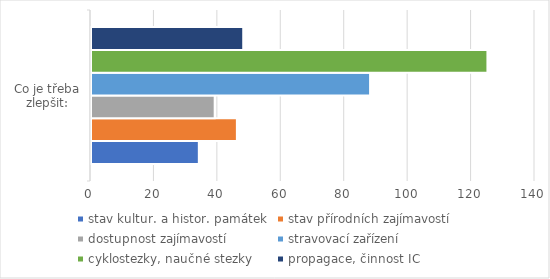
| Category | stav kultur. a histor. památek | stav přírodních zajímavostí  | dostupnost zajímavostí | stravovací zařízení | cyklostezky, naučné stezky  | propagace, činnost IC |
|---|---|---|---|---|---|---|
| 0 | 34 | 46 | 39 | 88 | 125 | 48 |